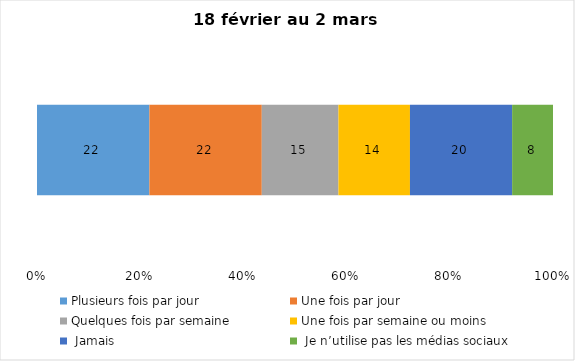
| Category | Plusieurs fois par jour | Une fois par jour | Quelques fois par semaine   | Une fois par semaine ou moins   |  Jamais   |  Je n’utilise pas les médias sociaux |
|---|---|---|---|---|---|---|
| 0 | 22 | 22 | 15 | 14 | 20 | 8 |